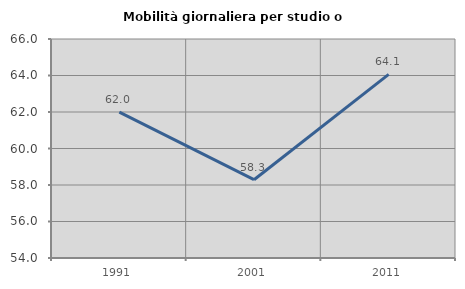
| Category | Mobilità giornaliera per studio o lavoro |
|---|---|
| 1991.0 | 61.995 |
| 2001.0 | 58.29 |
| 2011.0 | 64.062 |